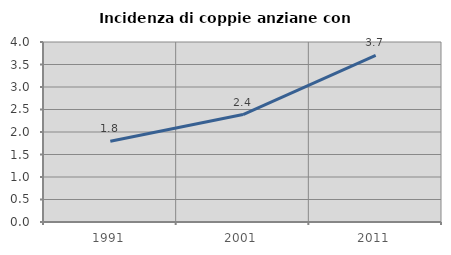
| Category | Incidenza di coppie anziane con figli |
|---|---|
| 1991.0 | 1.795 |
| 2001.0 | 2.387 |
| 2011.0 | 3.704 |